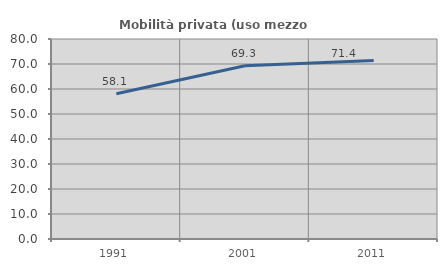
| Category | Mobilità privata (uso mezzo privato) |
|---|---|
| 1991.0 | 58.121 |
| 2001.0 | 69.304 |
| 2011.0 | 71.446 |